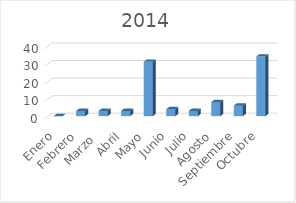
| Category | Series 0 |
|---|---|
| Enero | 0 |
| Febrero | 3 |
| Marzo  | 3 |
| Abril | 3 |
| Mayo | 31 |
| Junio | 4 |
| Julio | 3 |
| Agosto | 8 |
| Septiembre | 6 |
| Octubre | 34 |